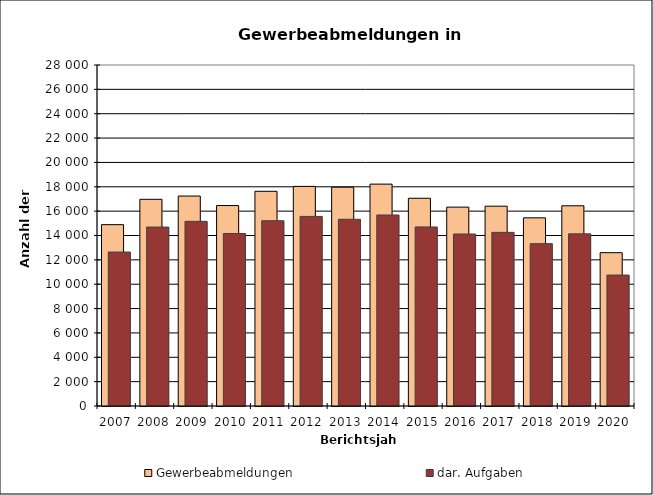
| Category | Gewerbeabmeldungen | dar. Aufgaben |
|---|---|---|
| 2007.0 | 14890 | 12642 |
| 2008.0 | 16972 | 14693 |
| 2009.0 | 17240 | 15163 |
| 2010.0 | 16460 | 14163 |
| 2011.0 | 17629 | 15213 |
| 2012.0 | 18032 | 15567 |
| 2013.0 | 17968 | 15333 |
| 2014.0 | 18219 | 15684 |
| 2015.0 | 17058 | 14703 |
| 2016.0 | 16329 | 14120 |
| 2017.0 | 16407 | 14259 |
| 2018.0 | 15450 | 13328 |
| 2019.0 | 16441 | 14135 |
| 2020.0 | 12589 | 10752 |